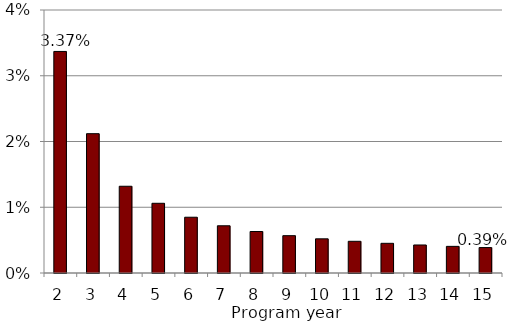
| Category | Series 0 |
|---|---|
| 2.0 | 0.034 |
| 3.0 | 0.021 |
| 4.0 | 0.013 |
| 5.0 | 0.011 |
| 6.0 | 0.008 |
| 7.0 | 0.007 |
| 8.0 | 0.006 |
| 9.0 | 0.006 |
| 10.0 | 0.005 |
| 11.0 | 0.005 |
| 12.0 | 0.005 |
| 13.0 | 0.004 |
| 14.0 | 0.004 |
| 15.0 | 0.004 |